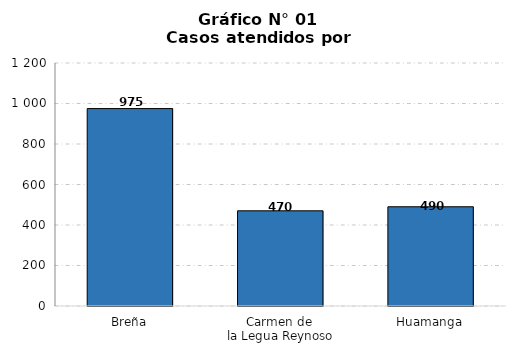
| Category | Series 0 |
|---|---|
| Breña | 975 |
| Carmen de 
la Legua Reynoso | 470 |
| Huamanga | 490 |